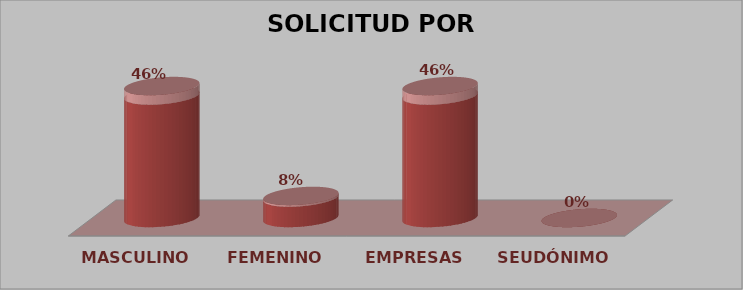
| Category | SOLICITUD POR GÉNERO | Series 1 |
|---|---|---|
| MASCULINO | 6 | 0.46 |
| FEMENINO | 1 | 0.08 |
| EMPRESAS | 6 | 0.46 |
| SEUDÓNIMO | 0 | 0 |